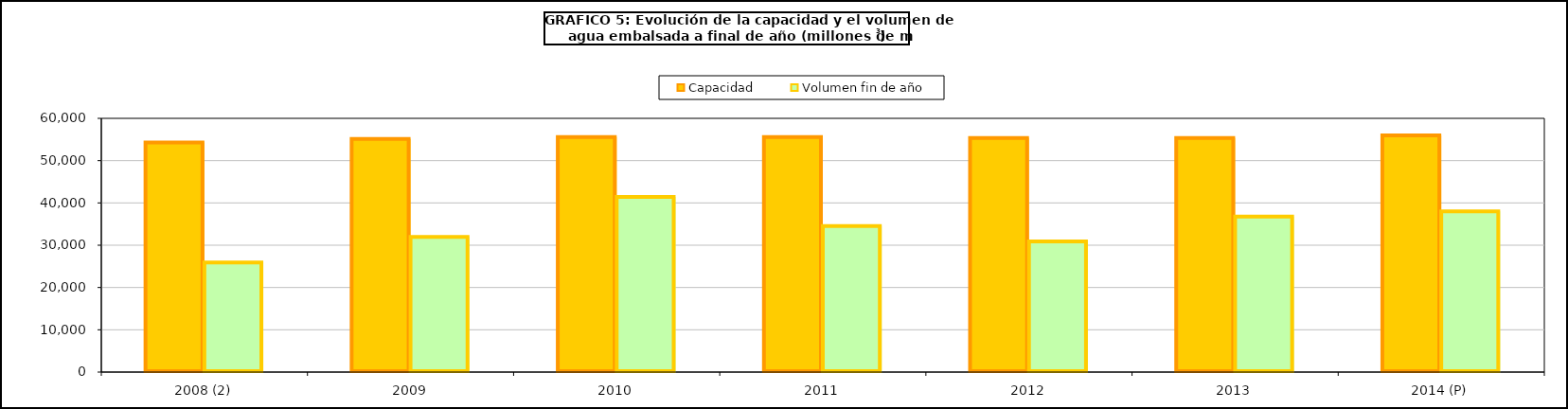
| Category | Capacidad | Volumen fin de año |
|---|---|---|
| 2008 (2) | 54308 | 25915 |
| 2009 | 55111 | 31945 |
| 2010 | 55586 | 41427 |
| 2011 | 55590 | 34536 |
| 2012 | 55327 | 30872 |
| 2013 | 55343 | 36761 |
| 2014 (P) | 55977 | 37993 |